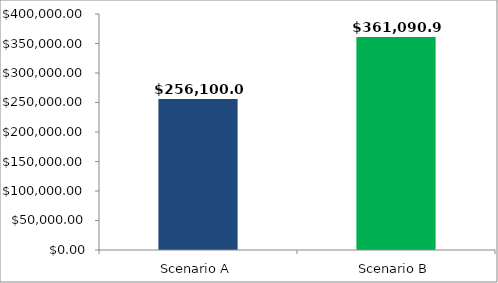
| Category | Cumulative Retirement Income (Today's Dollars): |
|---|---|
| Scenario A | 256100.02 |
| Scenario B | 361090.929 |